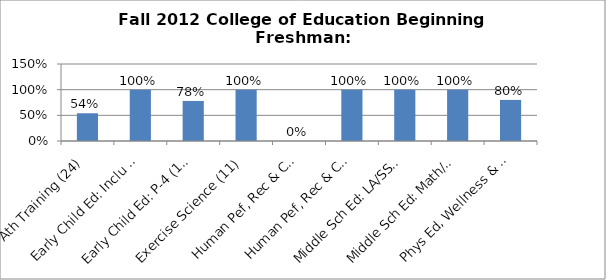
| Category | Series 0 |
|---|---|
| Ath Training (24) | 0.54 |
| Early Child Ed: Inclu (1) | 1 |
| Early Child Ed: P-4 (18) | 0.78 |
| Exercise Science (11) | 1 |
| Human Pef, Rec & Comm Sports (2) | 0 |
| Human Pef, Rec & Comm (1) | 1 |
| Middle Sch Ed: LA/SS (2) | 1 |
| Middle Sch Ed: Math/Sci: (1) | 1 |
| Phys Ed, Wellness & Leisure (20) | 0.8 |